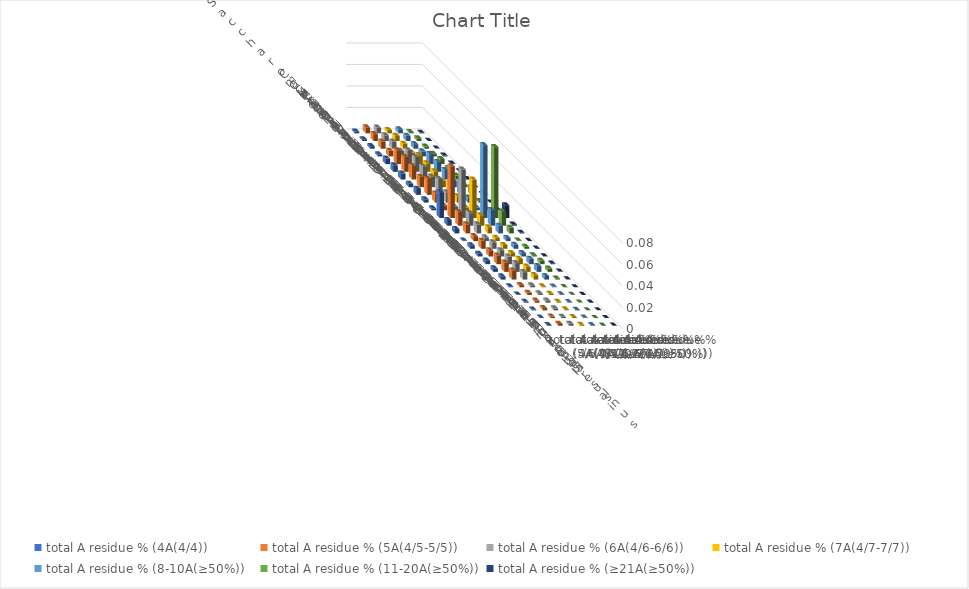
| Category | total A residue % (4A(4/4)) | total A residue % (5A(4/5-5/5)) | total A residue % (6A(4/6-6/6)) | total A residue % (7A(4/7-7/7)) | total A residue % (8-10A(≥50%)) | total A residue % (11-20A(≥50%)) | total A residue % (≥21A(≥50%)) |
|---|---|---|---|---|---|---|---|
| Saccharomyces cerevisiae S288c | 0.002 | 0.006 | 0.005 | 0.003 | 0.004 | 0.001 | 0.001 |
| Candida albicans | 0.002 | 0.006 | 0.005 | 0.005 | 0.005 | 0.003 | 0 |
| Candida auris | 0.002 | 0.007 | 0.007 | 0.005 | 0.004 | 0.002 | 0 |
| Candida tropicalis | 0.002 | 0.005 | 0.005 | 0.004 | 0.005 | 0.002 | 0.001 |
| Neurospora crassa | 0.005 | 0.013 | 0.013 | 0.008 | 0.009 | 0.005 | 0 |
| Magnaporthe oryzae | 0.006 | 0.014 | 0.014 | 0.008 | 0.009 | 0.003 | 0 |
| Trichoderma reesei | 0.006 | 0.013 | 0.012 | 0.008 | 0.009 | 0.004 | 0 |
| Cryptococcus neoformans | 0.003 | 0.01 | 0.01 | 0.006 | 0.006 | 0.002 | 0 |
| Ustilago maydis | 0.006 | 0.015 | 0.015 | 0.01 | 0.013 | 0.007 | 0.001 |
| Taiwanofungus camphoratus | 0.003 | 0.008 | 0.009 | 0.006 | 0.005 | 0.001 | 0 |
| Dictyostelium discoideum | 0.002 | 0.005 | 0.003 | 0.003 | 0.003 | 0.001 | 0 |
| Chlamydomonas reinhardtii | 0.024 | 0.048 | 0.045 | 0.036 | 0.068 | 0.066 | 0.012 |
| Drosophila melanogaster | 0.005 | 0.013 | 0.012 | 0.01 | 0.015 | 0.013 | 0.001 |
| Aedes aegypti | 0.004 | 0.008 | 0.008 | 0.006 | 0.007 | 0.005 | 0.001 |
| Plasmodium falciparum | 0.001 | 0.005 | 0.003 | 0.003 | 0.003 | 0.001 | 0 |
| Caenorhabditis elegans | 0.003 | 0.007 | 0.006 | 0.003 | 0.004 | 0.002 | 0 |
| Danio rerio | 0.003 | 0.006 | 0.006 | 0.003 | 0.003 | 0.001 | 0 |
| Mus musculus | 0.003 | 0.008 | 0.007 | 0.005 | 0.005 | 0.003 | 0.001 |
| Homo sapiens | 0.003 | 0.009 | 0.008 | 0.005 | 0.005 | 0.003 | 0 |
| Arabidopsis thaliana | 0.003 | 0.008 | 0.007 | 0.004 | 0.003 | 0.001 | 0 |
| Tetrahymena thermophila | 0.001 | 0.002 | 0.002 | 0.001 | 0.001 | 0 | 0 |
| Paramecium tetraurelia | 0 | 0.002 | 0.002 | 0.001 | 0.001 | 0 | 0 |
| Oxytricha trifallax | 0.001 | 0.002 | 0.002 | 0.001 | 0.001 | 0 | 0 |
| Stylonychia lemnae | 0.001 | 0.002 | 0.002 | 0.001 | 0 | 0 | 0 |
| Pseudocohnilembus persalinus | 0 | 0.001 | 0.001 | 0.001 | 0.001 | 0 | 0 |
| Stentor coeruleus | 0.001 | 0.002 | 0.002 | 0.001 | 0.001 | 0 | 0 |